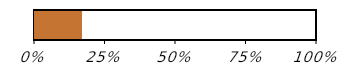
| Category | Tijek kupnje (1 od 6) |
|---|---|
| Kupljeno | 0.167 |